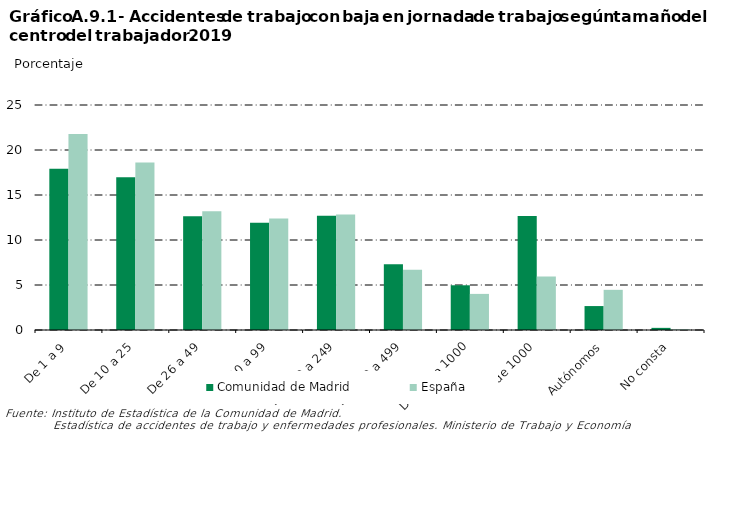
| Category | Comunidad de Madrid | España |
|---|---|---|
| 0 | 17.928 | 21.764 |
| 1 | 16.986 | 18.622 |
| 2 | 12.641 | 13.19 |
| 3 | 11.921 | 12.401 |
| 4 | 12.683 | 12.823 |
| 5 | 7.317 | 6.695 |
| 6 | 4.969 | 4.011 |
| 7 | 12.657 | 5.945 |
| 8 | 2.659 | 4.463 |
| 9 | 0.238 | 0.087 |